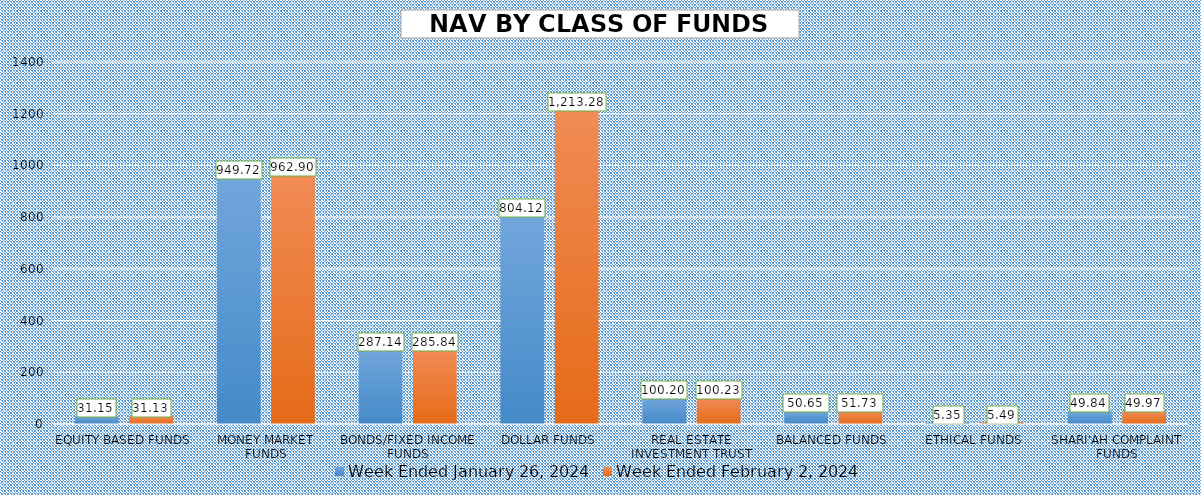
| Category | Week Ended January 26, 2024 | Week Ended February 2, 2024 |
|---|---|---|
| EQUITY BASED FUNDS | 31.15 | 31.133 |
| MONEY MARKET FUNDS | 949.717 | 962.897 |
| BONDS/FIXED INCOME FUNDS | 287.141 | 285.837 |
| DOLLAR FUNDS | 804.117 | 1213.278 |
| REAL ESTATE INVESTMENT TRUST | 100.205 | 100.226 |
| BALANCED FUNDS | 50.65 | 51.726 |
| ETHICAL FUNDS | 5.352 | 5.492 |
| SHARI'AH COMPLAINT FUNDS | 49.843 | 49.969 |